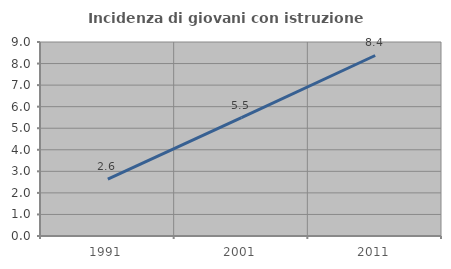
| Category | Incidenza di giovani con istruzione universitaria |
|---|---|
| 1991.0 | 2.638 |
| 2001.0 | 5.491 |
| 2011.0 | 8.374 |